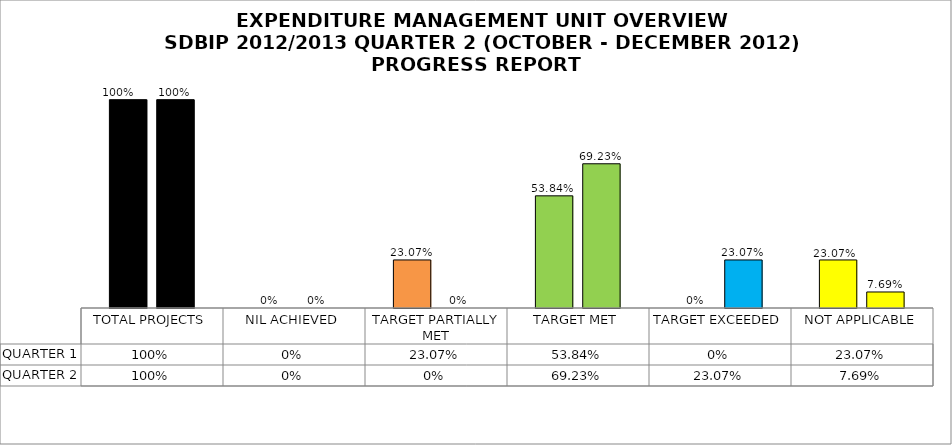
| Category | QUARTER 1 | QUARTER 2 |
|---|---|---|
| TOTAL PROJECTS | 1 | 1 |
| NIL ACHIEVED | 0 | 0 |
| TARGET PARTIALLY MET | 0.231 | 0 |
| TARGET MET | 0.538 | 0.692 |
| TARGET EXCEEDED | 0 | 0.231 |
| NOT APPLICABLE | 0.231 | 0.077 |